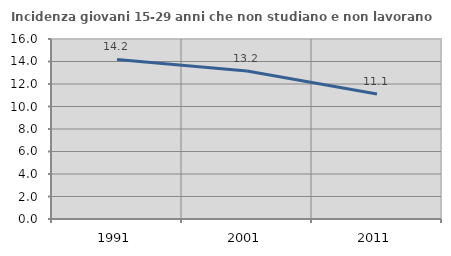
| Category | Incidenza giovani 15-29 anni che non studiano e non lavorano  |
|---|---|
| 1991.0 | 14.179 |
| 2001.0 | 13.158 |
| 2011.0 | 11.111 |